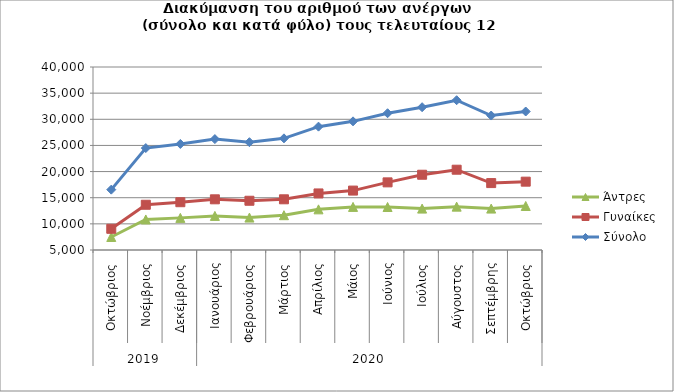
| Category | Άντρες | Γυναίκες | Σύνολο |
|---|---|---|---|
| 0 | 7491 | 9053 | 16544 |
| 1 | 10842 | 13653 | 24495 |
| 2 | 11144 | 14141 | 25285 |
| 3 | 11522 | 14692 | 26214 |
| 4 | 11203 | 14417 | 25620 |
| 5 | 11658 | 14695 | 26353 |
| 6 | 12774 | 15817 | 28591 |
| 7 | 13242 | 16362 | 29604 |
| 8 | 13223 | 17935 | 31158 |
| 9 | 12918 | 19395 | 32313 |
| 10 | 13294 | 20355 | 33649 |
| 11 | 12921 | 17797 | 30718 |
| 12 | 13416 | 18071 | 31487 |